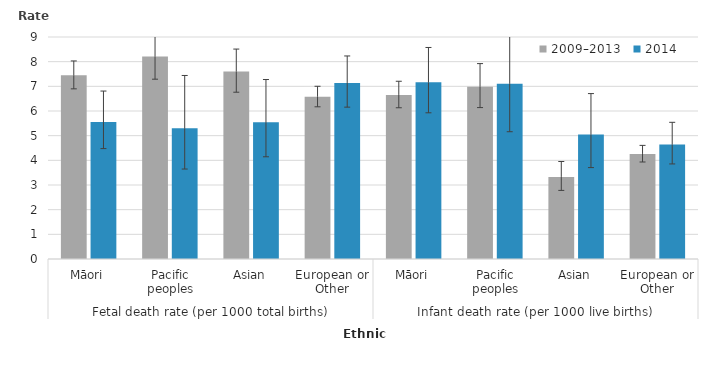
| Category | 2009–2013 | 2014 |
|---|---|---|
| 0 | 7.447 | 5.552 |
| 1 | 8.208 | 5.298 |
| 2 | 7.598 | 5.548 |
| 3 | 6.577 | 7.138 |
| 4 | 6.652 | 7.161 |
| 5 | 6.988 | 7.101 |
| 6 | 3.329 | 5.043 |
| 7 | 4.26 | 4.641 |